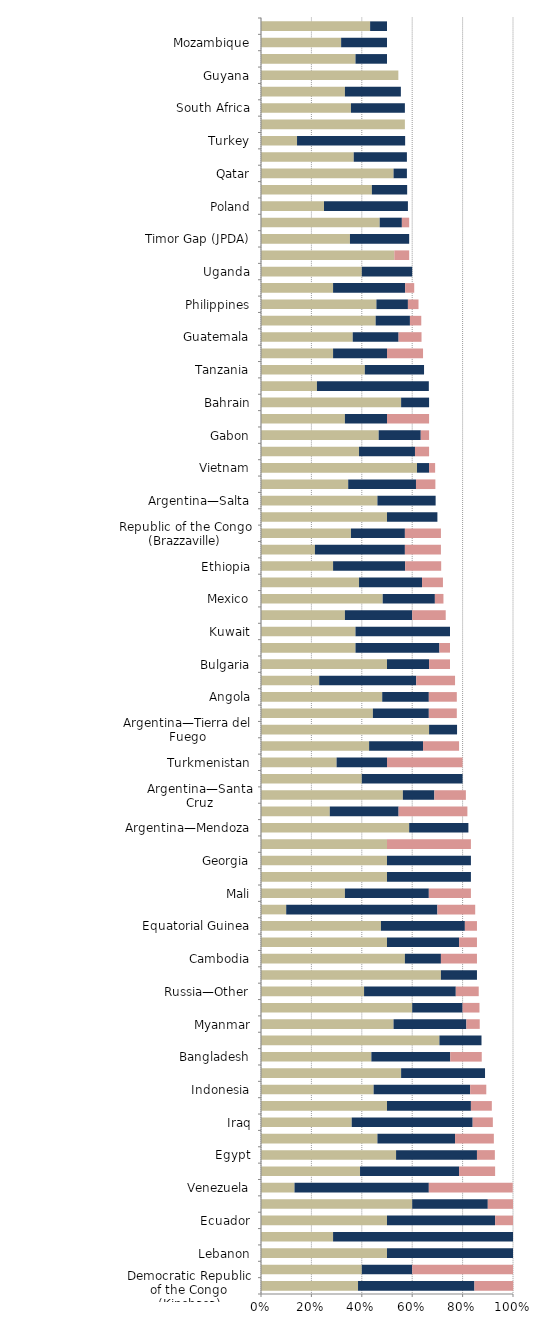
| Category |   Mild deterrent to investment |   Strong deterrent to investment |   Would not pursue investment due to this factor |
|---|---|---|---|
| Democratic Republic of the Congo (Kinshasa) | 0.385 | 0.462 | 0.154 |
| Kyrgyzstan | 0.4 | 0.2 | 0.4 |
| Lebanon | 0.5 | 0.5 | 0 |
| Syria | 0.286 | 0.714 | 0 |
| Ecuador | 0.5 | 0.429 | 0.071 |
| Russia—Offshore Arctic | 0.6 | 0.3 | 0.1 |
| Venezuela | 0.133 | 0.533 | 0.333 |
| Libya | 0.393 | 0.393 | 0.143 |
| Egypt | 0.536 | 0.321 | 0.071 |
| Ukraine | 0.462 | 0.308 | 0.154 |
| Iraq | 0.36 | 0.48 | 0.08 |
| Russia—Eastern Siberia | 0.5 | 0.333 | 0.083 |
| Indonesia | 0.447 | 0.383 | 0.064 |
| Russia—Offshore Sakhalin | 0.556 | 0.333 | 0 |
| Bangladesh | 0.438 | 0.313 | 0.125 |
| Argentina—Neuquen | 0.708 | 0.167 | 0 |
| Myanmar | 0.526 | 0.289 | 0.053 |
| Argentina—Chubut | 0.6 | 0.2 | 0.067 |
| Russia—Other | 0.409 | 0.364 | 0.091 |
| Greece | 0.714 | 0.143 | 0 |
| Cambodia | 0.571 | 0.143 | 0.143 |
| Cameroon | 0.5 | 0.286 | 0.071 |
| Equatorial Guinea | 0.476 | 0.333 | 0.048 |
| Yemen | 0.1 | 0.6 | 0.15 |
| Mali | 0.333 | 0.333 | 0.167 |
| Papua New Guinea | 0.5 | 0.333 | 0 |
| Georgia | 0.5 | 0.333 | 0 |
| Uzbekistan | 0.5 | 0 | 0.333 |
| Argentina—Mendoza | 0.588 | 0.235 | 0 |
| Iran | 0.273 | 0.273 | 0.273 |
| Argentina—Santa Cruz | 0.563 | 0.125 | 0.125 |
| Albania | 0.4 | 0.4 | 0 |
| Turkmenistan | 0.3 | 0.2 | 0.3 |
| South Sudan | 0.429 | 0.214 | 0.143 |
| Argentina—Tierra del Fuego | 0.667 | 0.111 | 0 |
| Niger | 0.444 | 0.222 | 0.111 |
| Angola | 0.481 | 0.185 | 0.111 |
| Bolivia | 0.231 | 0.385 | 0.154 |
| Bulgaria | 0.5 | 0.167 | 0.083 |
| Kazakhstan | 0.375 | 0.333 | 0.042 |
| Kuwait | 0.375 | 0.375 | 0 |
| Pakistan | 0.333 | 0.267 | 0.133 |
| Mexico | 0.483 | 0.207 | 0.034 |
| Nigeria | 0.389 | 0.25 | 0.083 |
| Ethiopia | 0.286 | 0.286 | 0.143 |
| Chad | 0.214 | 0.357 | 0.143 |
| Republic of the Congo (Brazzaville) | 0.357 | 0.214 | 0.143 |
| Mauritania | 0.5 | 0.2 | 0 |
| Argentina—Salta | 0.462 | 0.231 | 0 |
| China | 0.346 | 0.269 | 0.077 |
| Vietnam | 0.619 | 0.048 | 0.024 |
| Italy | 0.389 | 0.222 | 0.056 |
| Gabon | 0.467 | 0.167 | 0.033 |
| Somaliland | 0.333 | 0.167 | 0.167 |
| Bahrain | 0.556 | 0.111 | 0 |
| Algeria | 0.222 | 0.444 | 0 |
| Tanzania | 0.412 | 0.235 | 0 |
| Azerbaijan | 0.286 | 0.214 | 0.143 |
| Guatemala | 0.364 | 0.182 | 0.091 |
| Tunisia | 0.455 | 0.136 | 0.045 |
| Philippines | 0.458 | 0.125 | 0.042 |
| India | 0.286 | 0.286 | 0.036 |
| Uganda | 0.4 | 0.2 | 0 |
| Morocco | 0.529 | 0 | 0.059 |
| Timor Gap (JPDA) | 0.353 | 0.235 | 0 |
| Malaysia | 0.471 | 0.088 | 0.029 |
| Poland | 0.25 | 0.333 | 0 |
| Thailand | 0.44 | 0.14 | 0 |
| Qatar | 0.526 | 0.053 | 0 |
| Romania | 0.368 | 0.211 | 0 |
| Turkey | 0.143 | 0.429 | 0 |
| Cyprus | 0.571 | 0 | 0 |
| South Africa | 0.357 | 0.214 | 0 |
| Ivory Coast | 0.333 | 0.222 | 0 |
| Guyana | 0.545 | 0 | 0 |
| US Offshore—Pacific | 0.375 | 0.125 | 0 |
| Mozambique | 0.318 | 0.182 | 0 |
| Peru | 0.433 | 0.067 | 0 |